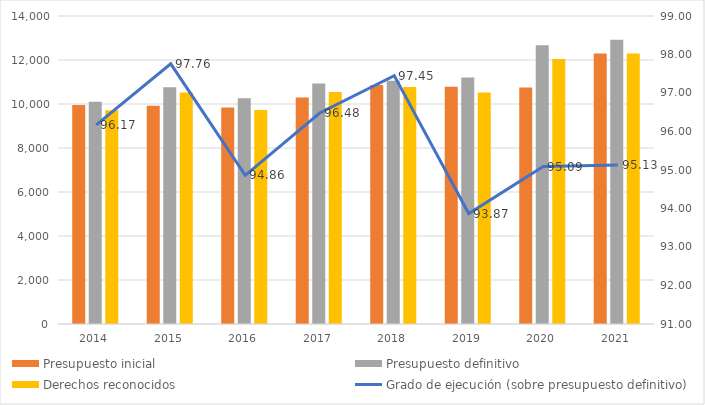
| Category | Presupuesto inicial | Presupuesto definitivo | Derechos reconocidos |
|---|---|---|---|
| 2014.0 | 9957.791 | 10105.328 | 9718.357 |
| 2015.0 | 9920.812 | 10763.44 | 10522.152 |
| 2016.0 | 9843.699 | 10256.08 | 9729.066 |
| 2017.0 | 10293.186 | 10933.955 | 10549.198 |
| 2018.0 | 10859.22 | 11055.9 | 10774.13 |
| 2019.0 | 10784.98 | 11204.58 | 10517.53 |
| 2020.0 | 10752.61 | 12666.41 | 12044.58 |
| 2021.0 | 12291.44 | 12922.55 | 12292.83 |